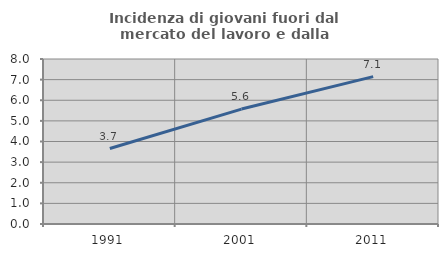
| Category | Incidenza di giovani fuori dal mercato del lavoro e dalla formazione  |
|---|---|
| 1991.0 | 3.66 |
| 2001.0 | 5.573 |
| 2011.0 | 7.146 |